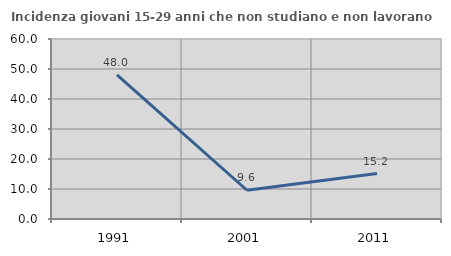
| Category | Incidenza giovani 15-29 anni che non studiano e non lavorano  |
|---|---|
| 1991.0 | 48.045 |
| 2001.0 | 9.583 |
| 2011.0 | 15.163 |